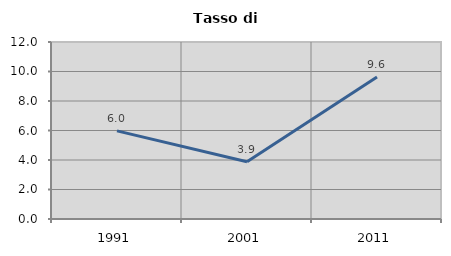
| Category | Tasso di disoccupazione   |
|---|---|
| 1991.0 | 5.976 |
| 2001.0 | 3.876 |
| 2011.0 | 9.635 |